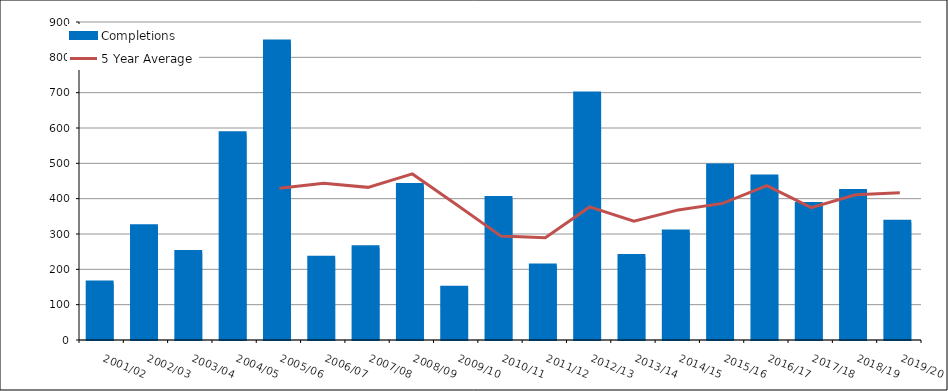
| Category | Completions |
|---|---|
| 2001/02 | 160 |
| 2002/03 | 319 |
| 2003/04 | 246 |
| 2004/05 | 582 |
| 2005/06 | 842 |
| 2006/07 | 230 |
| 2007/08 | 260 |
| 2008/09 | 436 |
| 2009/10 | 145 |
| 2010/11 | 399 |
| 2011/12 | 208 |
| 2012/13 | 695 |
| 2013/14 | 235 |
| 2014/15 | 304 |
| 2015/16 | 491 |
| 2016/17 | 460 |
| 2017/18 | 382 |
| 2018/19 | 419 |
| 2019/20 | 332 |